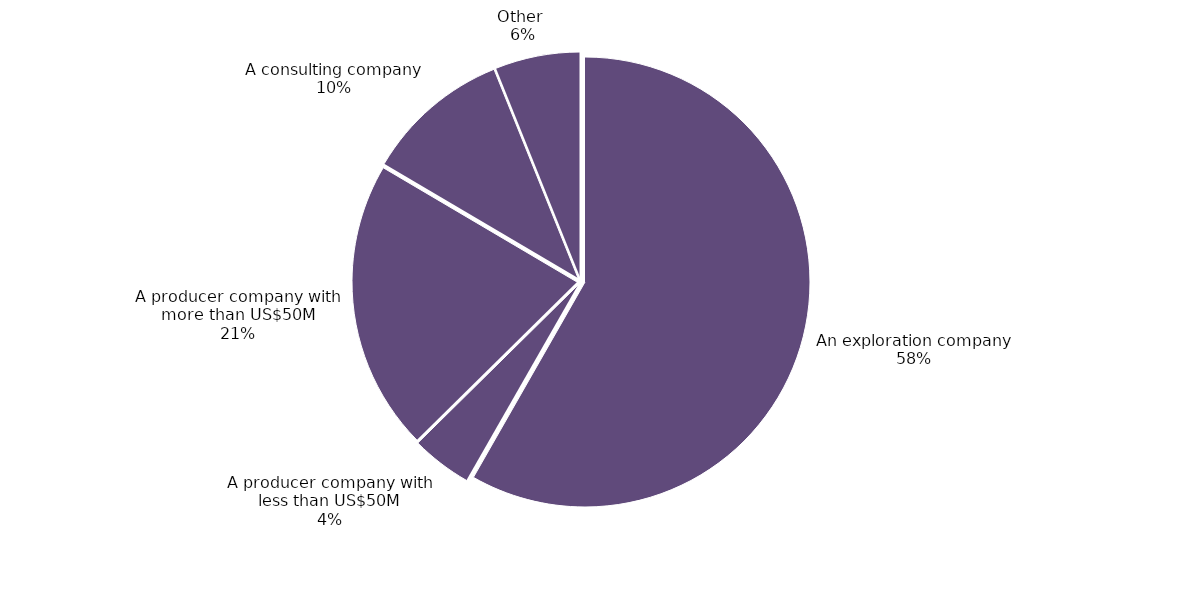
| Category | Series 0 |
|---|---|
| An exploration company | 0.583 |
| A producer company with less than US$50M | 0.044 |
| A producer company with more than US$50M | 0.209 |
| A consulting company | 0.104 |
| Other  | 0.061 |